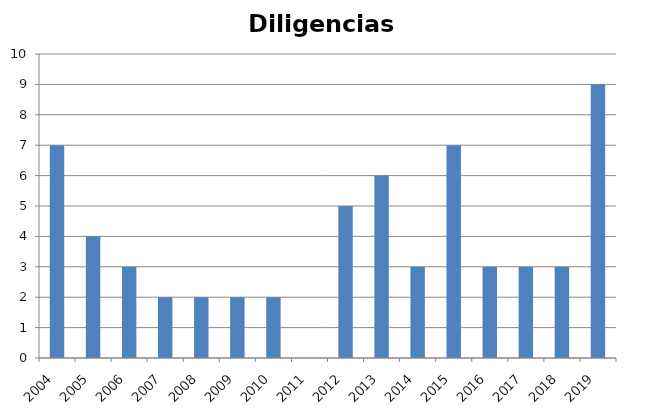
| Category | Diligencias Informativas |
|---|---|
| 2004.0 | 7 |
| 2005.0 | 4 |
| 2006.0 | 3 |
| 2007.0 | 2 |
| 2008.0 | 2 |
| 2009.0 | 2 |
| 2010.0 | 2 |
| 2011.0 | 0 |
| 2012.0 | 5 |
| 2013.0 | 6 |
| 2014.0 | 3 |
| 2015.0 | 7 |
| 2016.0 | 3 |
| 2017.0 | 3 |
| 2018.0 | 3 |
| 2019.0 | 9 |